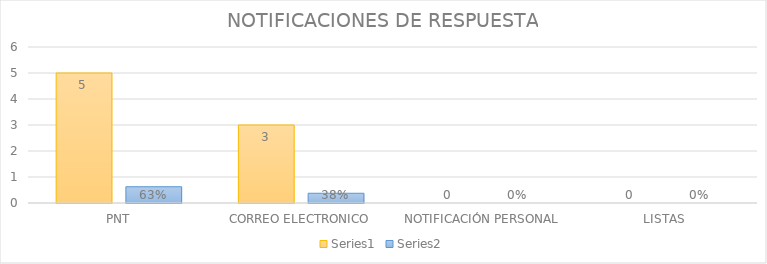
| Category | Series 3 | Series 4 |
|---|---|---|
| PNT | 5 | 0.625 |
| CORREO ELECTRONICO | 3 | 0.375 |
| NOTIFICACIÓN PERSONAL | 0 | 0 |
| LISTAS | 0 | 0 |